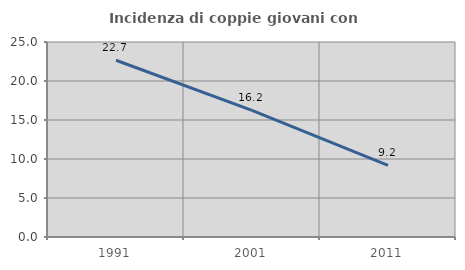
| Category | Incidenza di coppie giovani con figli |
|---|---|
| 1991.0 | 22.66 |
| 2001.0 | 16.228 |
| 2011.0 | 9.17 |